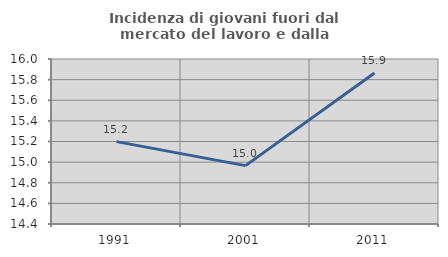
| Category | Incidenza di giovani fuori dal mercato del lavoro e dalla formazione  |
|---|---|
| 1991.0 | 15.199 |
| 2001.0 | 14.966 |
| 2011.0 | 15.863 |